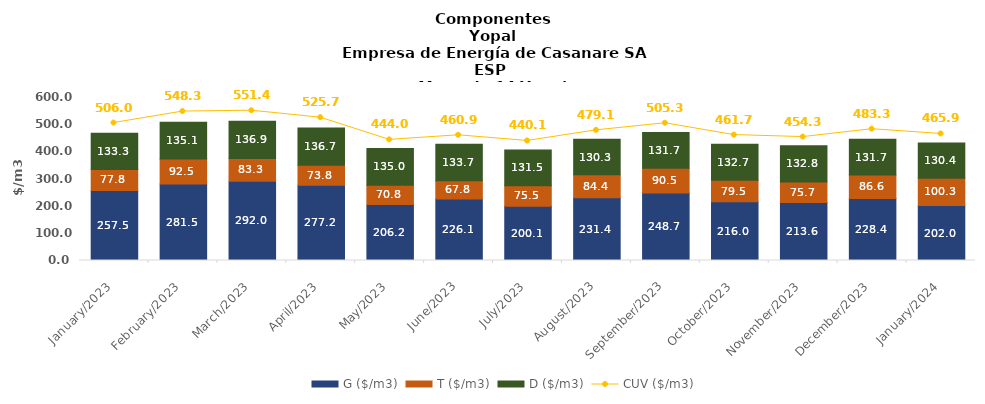
| Category | G ($/m3) | T ($/m3) | D ($/m3) |
|---|---|---|---|
| 2023-01-01 | 257.508 | 77.815 | 133.258 |
| 2023-02-01 | 281.451 | 92.545 | 135.074 |
| 2023-03-01 | 292.028 | 83.345 | 136.946 |
| 2023-04-01 | 277.158 | 73.848 | 136.749 |
| 2023-05-01 | 206.218 | 70.832 | 134.954 |
| 2023-06-01 | 226.097 | 67.766 | 133.705 |
| 2023-07-01 | 200.103 | 75.481 | 131.466 |
| 2023-08-01 | 231.393 | 84.415 | 130.283 |
| 2023-09-01 | 248.694 | 90.492 | 131.705 |
| 2023-10-01 | 216.024 | 79.542 | 132.704 |
| 2023-11-01 | 213.555 | 75.682 | 132.796 |
| 2023-12-01 | 228.438 | 86.567 | 131.735 |
| 2024-01-01 | 202.024 | 100.31 | 130.386 |